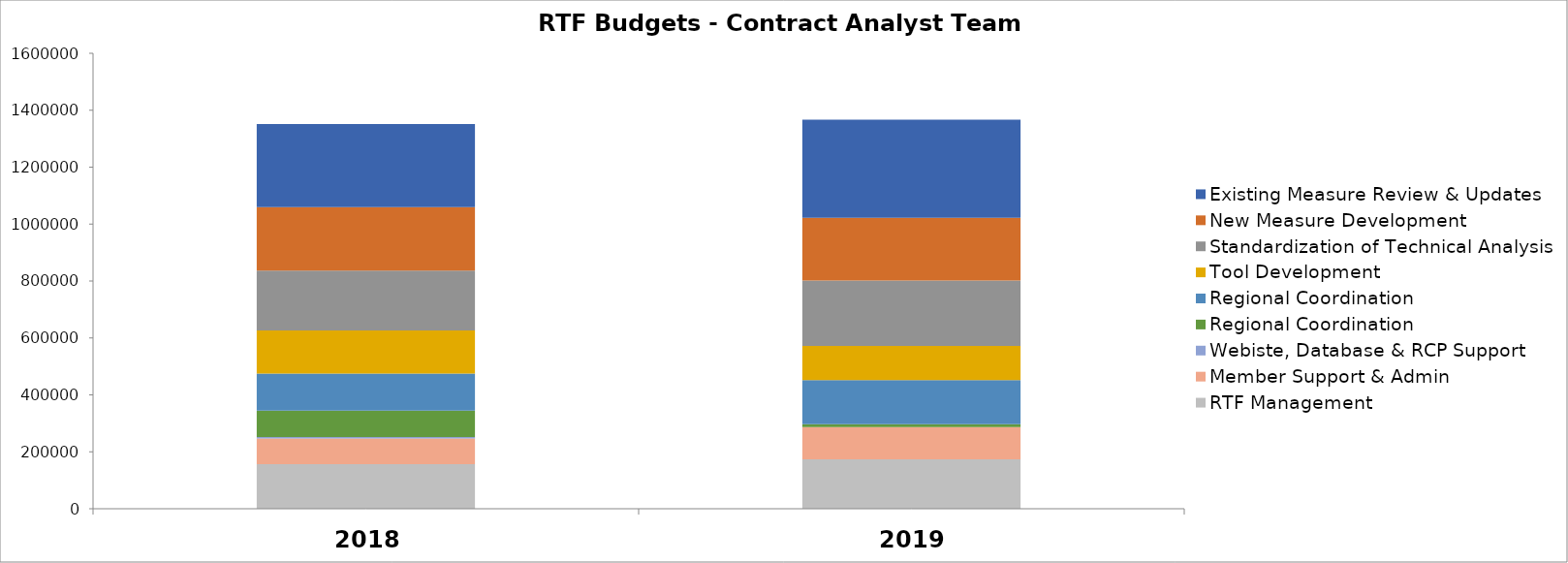
| Category | RTF Management | Member Support & Admin | Webiste, Database & RCP Support | Regional Coordination | Tool Development | Standardization of Technical Analysis | New Measure Development | Existing Measure Review & Updates |
|---|---|---|---|---|---|---|---|---|
| 0 | 157000 | 90000 | 5000 | 130000 | 151400 | 210000 | 223000 | 292000 |
| 1 | 174000 | 113000 | 0 | 155000 | 120000 | 230000 | 220000 | 345000 |